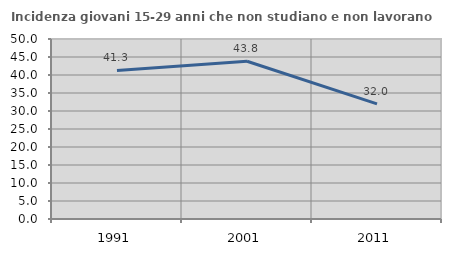
| Category | Incidenza giovani 15-29 anni che non studiano e non lavorano  |
|---|---|
| 1991.0 | 41.276 |
| 2001.0 | 43.825 |
| 2011.0 | 31.967 |